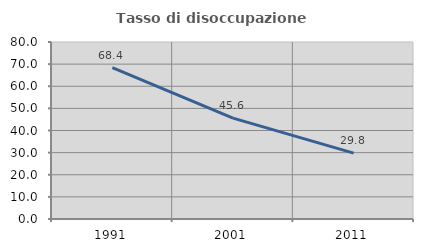
| Category | Tasso di disoccupazione giovanile  |
|---|---|
| 1991.0 | 68.432 |
| 2001.0 | 45.588 |
| 2011.0 | 29.773 |